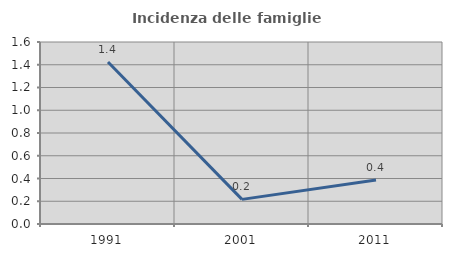
| Category | Incidenza delle famiglie numerose |
|---|---|
| 1991.0 | 1.425 |
| 2001.0 | 0.216 |
| 2011.0 | 0.386 |